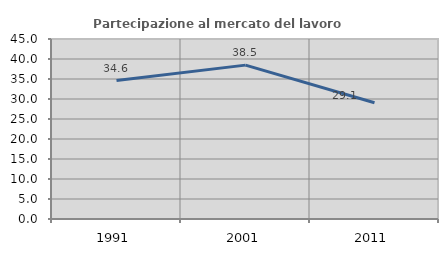
| Category | Partecipazione al mercato del lavoro  femminile |
|---|---|
| 1991.0 | 34.624 |
| 2001.0 | 38.47 |
| 2011.0 | 29.073 |